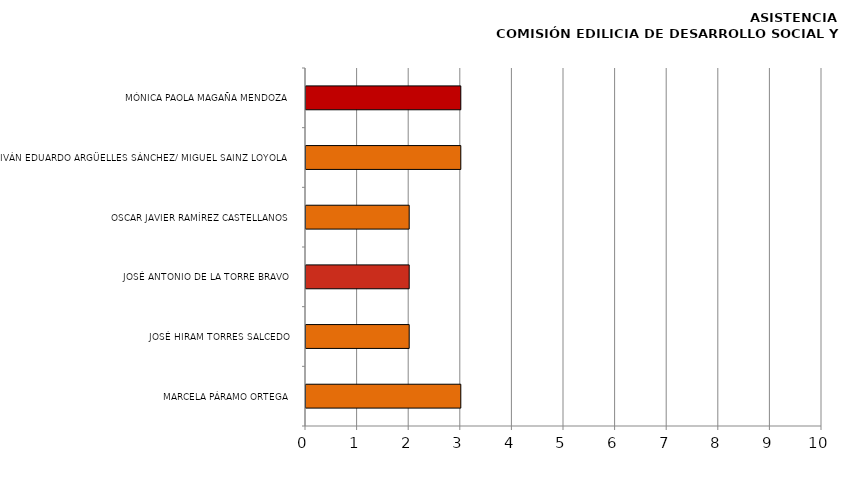
| Category | Series 0 |
|---|---|
| MARCELA PÁRAMO ORTEGA | 3 |
| JOSÉ HIRAM TORRES SALCEDO | 2 |
| JOSÉ ANTONIO DE LA TORRE BRAVO | 2 |
| OSCAR JAVIER RAMÍREZ CASTELLANOS | 2 |
| IVÁN EDUARDO ARGÜELLES SÁNCHEZ/ MIGUEL SAINZ LOYOLA | 3 |
| MÓNICA PAOLA MAGAÑA MENDOZA | 3 |